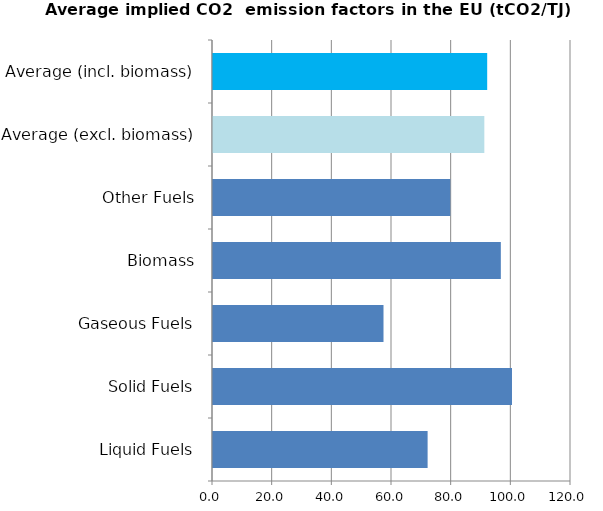
| Category | Series 0 |
|---|---|
| Liquid Fuels | 71.937 |
| Solid Fuels | 100.22 |
| Gaseous Fuels | 57.153 |
| Biomass | 96.48 |
| Other Fuels | 79.543 |
| Average (excl. biomass) | 90.95 |
| Average (incl. biomass) | 91.907 |